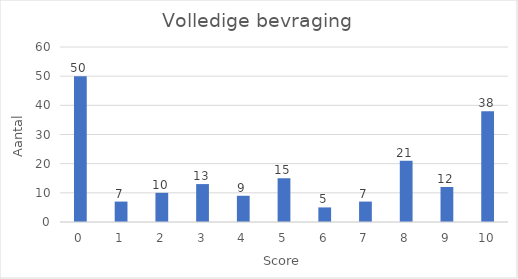
| Category | Aantal |
|---|---|
| 0.0 | 50 |
| 1.0 | 7 |
| 2.0 | 10 |
| 3.0 | 13 |
| 4.0 | 9 |
| 5.0 | 15 |
| 6.0 | 5 |
| 7.0 | 7 |
| 8.0 | 21 |
| 9.0 | 12 |
| 10.0 | 38 |